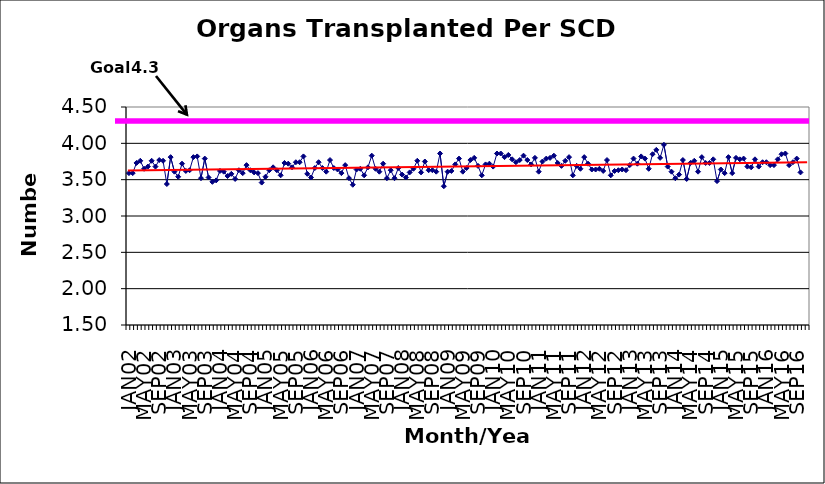
| Category | Series 0 |
|---|---|
| JAN02 | 3.59 |
| FEB02 | 3.59 |
| MAR02 | 3.73 |
| APR02 | 3.76 |
| MAY02 | 3.65 |
| JUN02 | 3.68 |
| JUL02 | 3.76 |
| AUG02 | 3.68 |
| SEP02 | 3.77 |
| OCT02 | 3.76 |
| NOV02 | 3.44 |
| DEC02 | 3.81 |
| JAN03 | 3.61 |
| FEB03 | 3.54 |
| MAR03 | 3.72 |
| APR03 | 3.62 |
| MAY03 | 3.63 |
| JUN03 | 3.81 |
| JUL03 | 3.82 |
| AUG03 | 3.52 |
| SEP03 | 3.79 |
| OCT03 | 3.53 |
| NOV03 | 3.47 |
| DEC03 | 3.49 |
| JAN04 | 3.62 |
| FEB04 | 3.61 |
| MAR04 | 3.55 |
| APR04 | 3.58 |
| MAY04 | 3.51 |
| JUN04 | 3.63 |
| JUL04 | 3.59 |
| AUG04 | 3.7 |
| SEP04 | 3.63 |
| OCT04 | 3.6 |
| NOV04 | 3.59 |
| DEC04 | 3.46 |
| JAN05 | 3.54 |
| FEB05 | 3.63 |
| MAR05 | 3.67 |
| APR05 | 3.63 |
| MAY05 | 3.56 |
| JUN05 | 3.73 |
| JUL05 | 3.72 |
| AUG05 | 3.67 |
| SEP05 | 3.74 |
| OCT05 | 3.74 |
| NOV05 | 3.82 |
| DEC05 | 3.58 |
| JAN06 | 3.53 |
| FEB06 | 3.66 |
| MAR06 | 3.74 |
| APR06 | 3.66 |
| MAY06 | 3.61 |
| JUN06 | 3.77 |
| JUL06 | 3.66 |
| AUG06 | 3.64 |
| SEP06 | 3.59 |
| OCT06 | 3.7 |
| NOV06 | 3.52 |
| DEC06 | 3.43 |
| JAN07 | 3.64 |
| FEB07 | 3.65 |
| MAR07 | 3.56 |
| APR07 | 3.67 |
| MAY07 | 3.83 |
| JUN07 | 3.65 |
| JUL07 | 3.61 |
| AUG07 | 3.72 |
| SEP07 | 3.52 |
| OCT07 | 3.63 |
| NOV07 | 3.52 |
| DEC07 | 3.66 |
| JAN08 | 3.57 |
| FEB08 | 3.53 |
| MAR08 | 3.6 |
| APR08 | 3.65 |
| MAY08 | 3.76 |
| JUN08 | 3.6 |
| JUL08 | 3.75 |
| AUG08 | 3.63 |
| SEP08 | 3.63 |
| OCT08 | 3.61 |
| NOV08 | 3.86 |
| DEC08 | 3.41 |
| JAN09 | 3.61 |
| FEB09 | 3.62 |
| MAR09 | 3.71 |
| APR09 | 3.79 |
| MAY09 | 3.61 |
| JUN09 | 3.66 |
| JUL09 | 3.77 |
| AUG09 | 3.8 |
| SEP09 | 3.69 |
| OCT09 | 3.56 |
| NOV09 | 3.71 |
| DEC09 | 3.72 |
| JAN10 | 3.68 |
| FEB10 | 3.86 |
| MAR10 | 3.86 |
| APR10 | 3.81 |
| MAY10 | 3.84 |
| JUN10 | 3.78 |
| JUL10 | 3.74 |
| AUG10 | 3.77 |
| SEP10 | 3.83 |
| OCT10 | 3.77 |
| NOV10 | 3.71 |
| DEC10 | 3.8 |
| JAN11 | 3.61 |
| FEB11 | 3.75 |
| MAR11 | 3.79 |
| APR11 | 3.8 |
| MAY11 | 3.83 |
| JUN11 | 3.73 |
| JUL11 | 3.69 |
| AUG11 | 3.76 |
| SEP11 | 3.81 |
| OCT11 | 3.56 |
| NOV11 | 3.69 |
| DEC11 | 3.65 |
| JAN12 | 3.81 |
| FEB12 | 3.72 |
| MAR12 | 3.64 |
| APR12 | 3.64 |
| MAY12 | 3.65 |
| JUN12 | 3.62 |
| JUL12 | 3.77 |
| AUG12 | 3.56 |
| SEP12 | 3.62 |
| OCT12 | 3.63 |
| NOV12 | 3.64 |
| DEC12 | 3.63 |
| JAN13 | 3.7 |
| FEB13 | 3.79 |
| MAR13 | 3.72 |
| APR13 | 3.82 |
| MAY13 | 3.79 |
| JUN13 | 3.65 |
| JUL13 | 3.85 |
| AUG13 | 3.91 |
| SEP13 | 3.8 |
| OCT13 | 3.98 |
| NOV13 | 3.68 |
| DEC13 | 3.61 |
| JAN14 | 3.52 |
| FEB14 | 3.57 |
| MAR14 | 3.77 |
| APR14 | 3.51 |
| MAY14 | 3.73 |
| JUN14 | 3.76 |
| JUL14 | 3.61 |
| AUG14 | 3.81 |
| SEP14 | 3.73 |
| OCT14 | 3.73 |
| NOV14 | 3.78 |
| DEC14 | 3.48 |
| JAN15 | 3.64 |
| FEB15 | 3.59 |
| MAR15 | 3.81 |
| APR15 | 3.59 |
| MAY15 | 3.8 |
| JUN15 | 3.78 |
| JUL15 | 3.79 |
| AUG15 | 3.68 |
| SEP15 | 3.67 |
| OCT15 | 3.78 |
| NOV15 | 3.68 |
| DEC15 | 3.74 |
| JAN16 | 3.74 |
| FEB16 | 3.7 |
| MAR16 | 3.7 |
| APR16 | 3.78 |
| MAY16 | 3.85 |
| JUN16 | 3.86 |
| JUL16 | 3.7 |
| AUG16 | 3.74 |
| SEP16 | 3.79 |
| OCT16 | 3.6 |